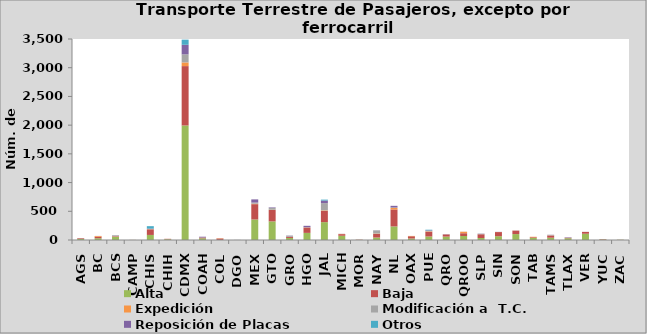
| Category | Alta                                         | Baja | Expedición | Modificación a  T.C. | Reposición de Placas | Otros |
|---|---|---|---|---|---|---|
| AGS | 18 | 12 | 1 | 3 | 0 | 0 |
| BC | 31 | 26 | 13 | 0 | 1 | 0 |
| BCS | 54 | 10 | 2 | 16 | 1 | 0 |
| CAMP | 1 | 1 | 0 | 0 | 0 | 0 |
| CHIS | 88 | 98 | 3 | 4 | 5 | 43 |
| CHIH | 13 | 7 | 1 | 0 | 0 | 0 |
| CDMX | 1994 | 1034 | 64 | 140 | 167 | 90 |
| COAH | 30 | 12 | 1 | 1 | 13 | 0 |
| COL | 1 | 25 | 5 | 0 | 0 | 0 |
| DGO | 0 | 0 | 0 | 2 | 0 | 0 |
| MEX | 357 | 267 | 8 | 20 | 55 | 0 |
| GTO | 324 | 198 | 5 | 32 | 9 | 0 |
| GRO | 36 | 18 | 1 | 20 | 3 | 0 |
| HGO | 124 | 93 | 2 | 4 | 24 | 0 |
| JAL | 311 | 194 | 10 | 127 | 45 | 16 |
| MICH | 74 | 28 | 4 | 1 | 1 | 0 |
| MOR | 2 | 3 | 2 | 0 | 1 | 0 |
| NAY | 43 | 61 | 8 | 56 | 1 | 0 |
| NL | 236 | 296 | 27 | 7 | 29 | 0 |
| OAX | 26 | 39 | 6 | 0 | 0 | 0 |
| PUE | 61 | 82 | 8 | 9 | 8 | 11 |
| QRO | 59 | 37 | 2 | 0 | 4 | 0 |
| QROO | 70 | 48 | 26 | 0 | 1 | 0 |
| SLP | 35 | 65 | 0 | 10 | 2 | 0 |
| SIN | 66 | 72 | 1 | 2 | 1 | 0 |
| SON | 103 | 57 | 4 | 0 | 3 | 0 |
| TAB | 36 | 12 | 8 | 0 | 0 | 0 |
| TAMS | 40 | 39 | 1 | 11 | 1 | 0 |
| TLAX | 31 | 8 | 0 | 0 | 7 | 0 |
| VER | 109 | 32 | 0 | 0 | 1 | 0 |
| YUC | 9 | 7 | 0 | 0 | 0 | 0 |
| ZAC | 4 | 2 | 0 | 0 | 0 | 0 |